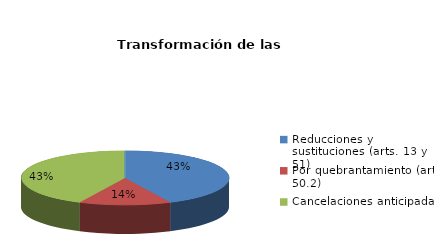
| Category | Series 0 |
|---|---|
| Reducciones y sustituciones (arts. 13 y 51) | 3 |
| Por quebrantamiento (art. 50.2) | 1 |
| Cancelaciones anticipadas | 3 |
| Traslado a Centros Penitenciarios | 0 |
| Conversión internamientos en cerrados (art. 51.2) | 0 |